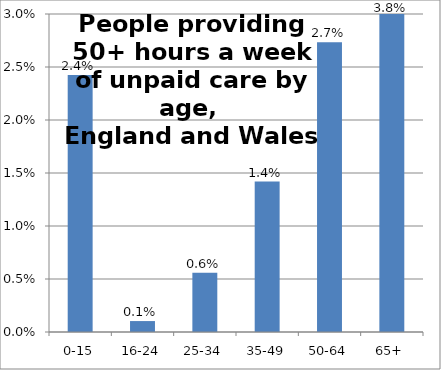
| Category | Series 0 |
|---|---|
| 0-15 | 0.024 |
| 16-24 | 0.001 |
| 25-34 | 0.006 |
| 35-49 | 0.014 |
| 50-64 | 0.027 |
| 65+ | 0.038 |